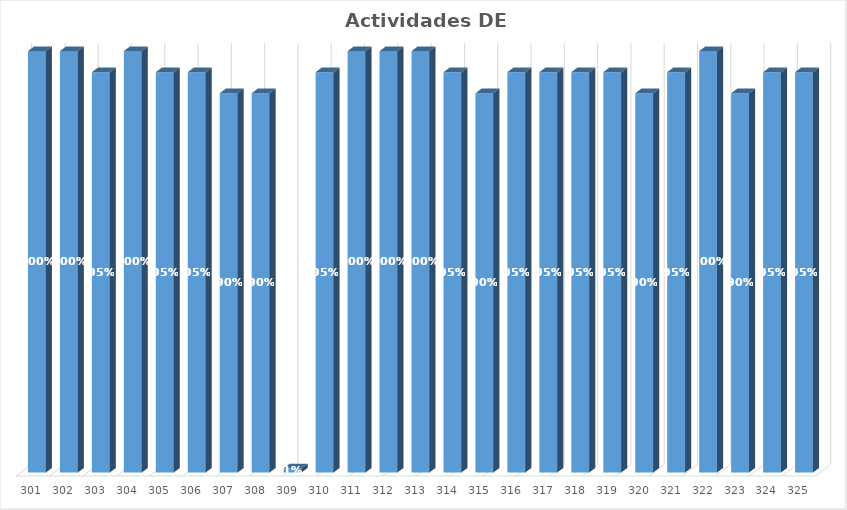
| Category | % Avance |
|---|---|
| 301.0 | 1 |
| 302.0 | 1 |
| 303.0 | 0.95 |
| 304.0 | 1 |
| 305.0 | 0.95 |
| 306.0 | 0.95 |
| 307.0 | 0.9 |
| 308.0 | 0.9 |
| 309.0 | 0.01 |
| 310.0 | 0.95 |
| 311.0 | 1 |
| 312.0 | 1 |
| 313.0 | 1 |
| 314.0 | 0.95 |
| 315.0 | 0.9 |
| 316.0 | 0.95 |
| 317.0 | 0.95 |
| 318.0 | 0.95 |
| 319.0 | 0.95 |
| 320.0 | 0.9 |
| 321.0 | 0.95 |
| 322.0 | 1 |
| 323.0 | 0.9 |
| 324.0 | 0.95 |
| 325.0 | 0.95 |